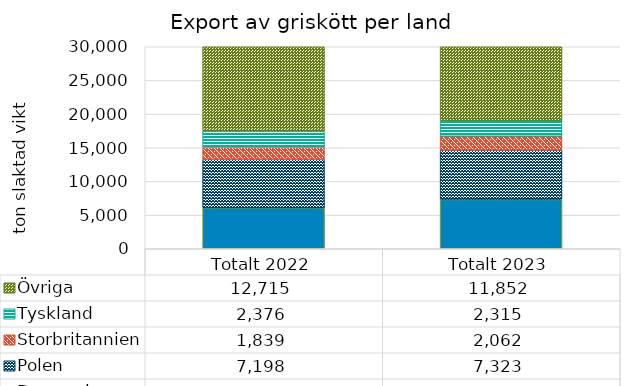
| Category | Danmark | Polen | Storbritannien | Tyskland | Övriga |
|---|---|---|---|---|---|
| Totalt 2022 | 6071.553 | 7197.728 | 1838.827 | 2375.853 | 12714.736 |
| Totalt 2023 | 7323.099 | 7323.16 | 2062.16 | 2314.569 | 11851.658 |